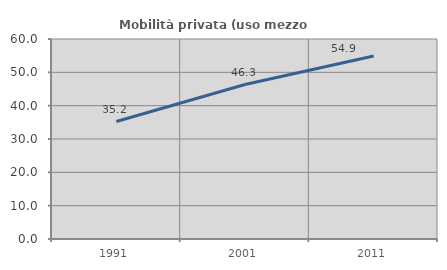
| Category | Mobilità privata (uso mezzo privato) |
|---|---|
| 1991.0 | 35.232 |
| 2001.0 | 46.349 |
| 2011.0 | 54.918 |